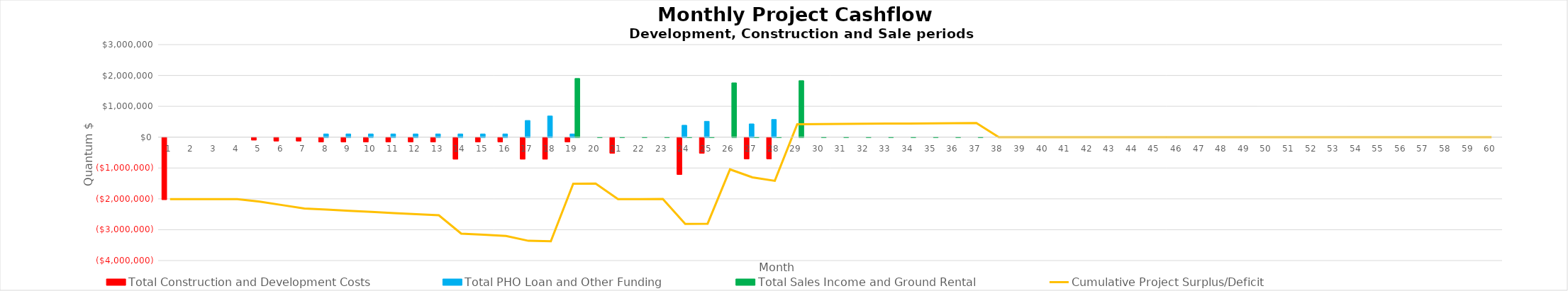
| Category | Total Construction and Development Costs | Total PHO Loan and Other Funding  | Total Sales Income and Ground Rental  |
|---|---|---|---|
| 0 | -2010000 | 0 | 0 |
| 1 | 0 | 0 | 0 |
| 2 | 0 | 0 | 0 |
| 3 | 0 | 0 | 0 |
| 4 | -80193.333 | 0 | 0 |
| 5 | -111050.476 | 0 | 0 |
| 6 | -111050.476 | 0 | 0 |
| 7 | -141050.476 | 104244.188 | 0 |
| 8 | -141050.476 | 104244.188 | 0 |
| 9 | -141050.476 | 104244.188 | 0 |
| 10 | -141050.476 | 104244.188 | 0 |
| 11 | -141050.476 | 104244.188 | 0 |
| 12 | -141050.476 | 104244.188 | 0 |
| 13 | -698800.476 | 104244.188 | 0 |
| 14 | -141050.476 | 104244.188 | 0 |
| 15 | -141050.476 | 104244.188 | 0 |
| 16 | -698800.476 | 540390.188 | 0 |
| 17 | -698800.476 | 685772.188 | 0 |
| 18 | -141050.476 | 104244.188 | 1901975 |
| 19 | 0 | 0 | 1975 |
| 20 | -506000 | 0 | 1975 |
| 21 | 0 | 0 | 1975 |
| 22 | 0 | 0 | 1975 |
| 23 | -1196000 | 385150.5 | 1975 |
| 24 | -506000 | 513534 | 1975 |
| 25 | 0 | 0 | 1760196.739 |
| 26 | -690000 | 429633.75 | 3675 |
| 27 | -690000 | 572845 | 3675 |
| 28 | 0 | 0 | 1831511.957 |
| 29 | 0 | 0 | 5425 |
| 30 | 0 | 0 | 5425 |
| 31 | 0 | 0 | 5425 |
| 32 | 0 | 0 | 5425 |
| 33 | 0 | 0 | 5425 |
| 34 | 0 | 0 | 5425 |
| 35 | 0 | 0 | 5425 |
| 36 | 0 | 0 | 5425 |
| 37 | 0 | 0 | 0 |
| 38 | 0 | 0 | 0 |
| 39 | 0 | 0 | 0 |
| 40 | 0 | 0 | 0 |
| 41 | 0 | 0 | 0 |
| 42 | 0 | 0 | 0 |
| 43 | 0 | 0 | 0 |
| 44 | 0 | 0 | 0 |
| 45 | 0 | 0 | 0 |
| 46 | 0 | 0 | 0 |
| 47 | 0 | 0 | 0 |
| 48 | 0 | 0 | 0 |
| 49 | 0 | 0 | 0 |
| 50 | 0 | 0 | 0 |
| 51 | 0 | 0 | 0 |
| 52 | 0 | 0 | 0 |
| 53 | 0 | 0 | 0 |
| 54 | 0 | 0 | 0 |
| 55 | 0 | 0 | 0 |
| 56 | 0 | 0 | 0 |
| 57 | 0 | 0 | 0 |
| 58 | 0 | 0 | 0 |
| 59 | 0 | 0 | 0 |